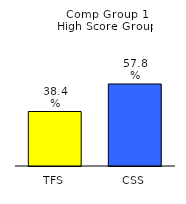
| Category | Series 0 |
|---|---|
| TFS | 0.384 |
| CSS | 0.578 |